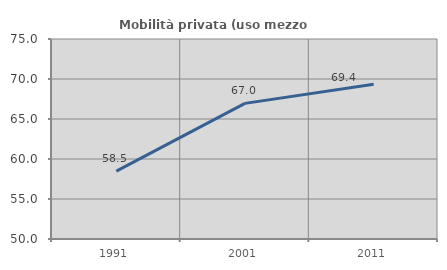
| Category | Mobilità privata (uso mezzo privato) |
|---|---|
| 1991.0 | 58.481 |
| 2001.0 | 66.954 |
| 2011.0 | 69.356 |